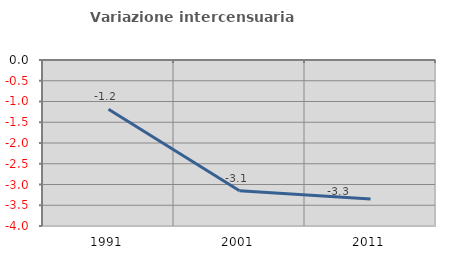
| Category | Variazione intercensuaria annua |
|---|---|
| 1991.0 | -1.186 |
| 2001.0 | -3.15 |
| 2011.0 | -3.348 |